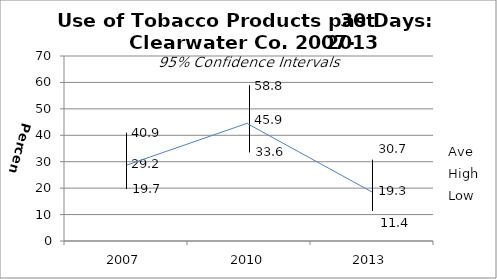
| Category | Ave | High | Low |
|---|---|---|---|
| 2007.0 | 29.2 | 40.9 | 19.7 |
| 2010.0 | 45.9 | 58.8 | 33.6 |
| 2013.0 | 19.3 | 30.7 | 11.4 |